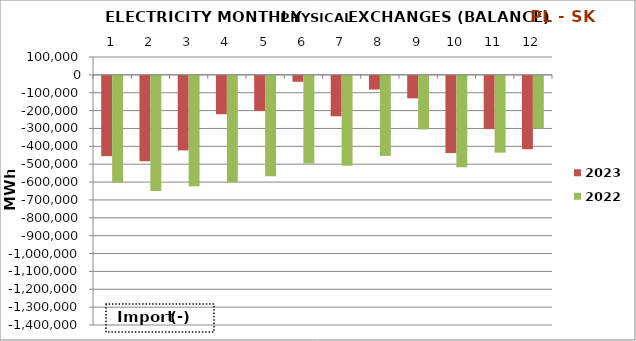
| Category | 2023 | 2022 |
|---|---|---|
| 0 | -449351.3 | -597977.6 |
| 1 | -477414.3 | -644520.9 |
| 2 | -417082 | -618262.3 |
| 3 | -214525 | -595868.9 |
| 4 | -196891.7 | -562136.2 |
| 5 | -33193 | -489812.2 |
| 6 | -226353.2 | -502689.6 |
| 7 | -76521.9 | -447989.1 |
| 8 | -125607.5 | -299789.3 |
| 9 | -432159.7 | -511613.4 |
| 10 | -297949.2 | -429710.4 |
| 11 | -410570 | -293451.9 |